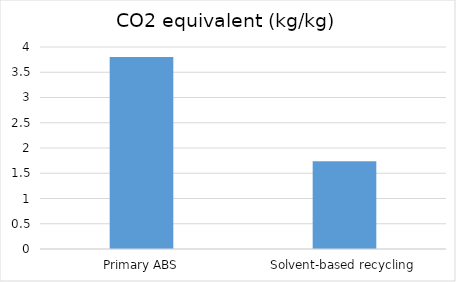
| Category | CO2 equivalent (kg/kg) |
|---|---|
| Primary ABS | 3.8 |
| Solvent-based recycling | 1.74 |